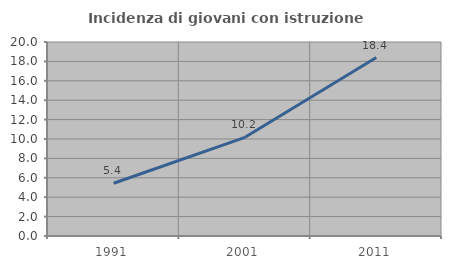
| Category | Incidenza di giovani con istruzione universitaria |
|---|---|
| 1991.0 | 5.442 |
| 2001.0 | 10.175 |
| 2011.0 | 18.399 |